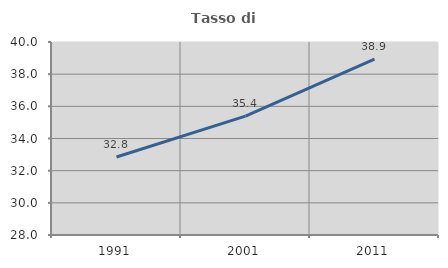
| Category | Tasso di occupazione   |
|---|---|
| 1991.0 | 32.849 |
| 2001.0 | 35.387 |
| 2011.0 | 38.929 |